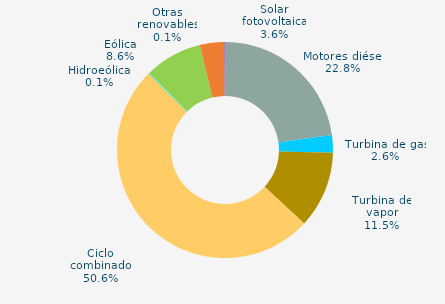
| Category | Series 0 |
|---|---|
| Motores diésel | 22.769 |
| Turbina de gas | 2.639 |
| Turbina de vapor | 11.49 |
| Ciclo combinado | 50.611 |
| Cogeneración | 0 |
| Hidráulica | 0.022 |
| Hidroeólica | 0.136 |
| Eólica | 8.57 |
| Solar fotovoltaica | 3.644 |
| Otras renovables | 0.117 |